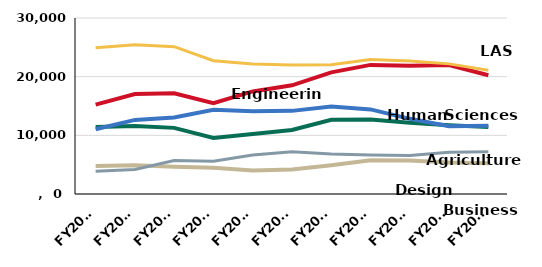
| Category | Agriculture and Life Sciences | Business | Design | Engineering | Human Sciences | Liberal Arts and Sciences |
|---|---|---|---|---|---|---|
| FY2009 | 11432 | 4758 | 3857 | 15230 | 11037 | 24928 |
| FY2010 | 11577 | 4896 | 4183 | 17050 | 12626 | 25421 |
| FY2011 | 11272 | 4626 | 5725 | 17181 | 13050 | 25117 |
| FY2012 | 9536 | 4483 | 5565 | 15487 | 14374 | 22729 |
| FY2013 | 10222 | 3987 | 6642 | 17484 | 14088 | 22156 |
| FY2014 | 10905 | 4173 | 7204 | 18520 | 14170 | 22000 |
| FY2015 | 12642.43 | 4905.4 | 6836.25 | 20741.12 | 14906.85 | 22033.27 |
| FY2016 | 12696.21 | 5767.24 | 6667.25 | 22006.55 | 14415.68 | 22910.29 |
| FY2017 | 12162.291 | 5691.7 | 6557.25 | 21877.035 | 12814.15 | 22667.988 |
| FY2018 | 11736.58 | 5368.67 | 7119.3 | 21977.26 | 11550.33 | 22181.35 |
| FY2019 | 11428.315 | 5236.7 | 7217.136 | 20234.713 | 11639.374 | 21082.99 |